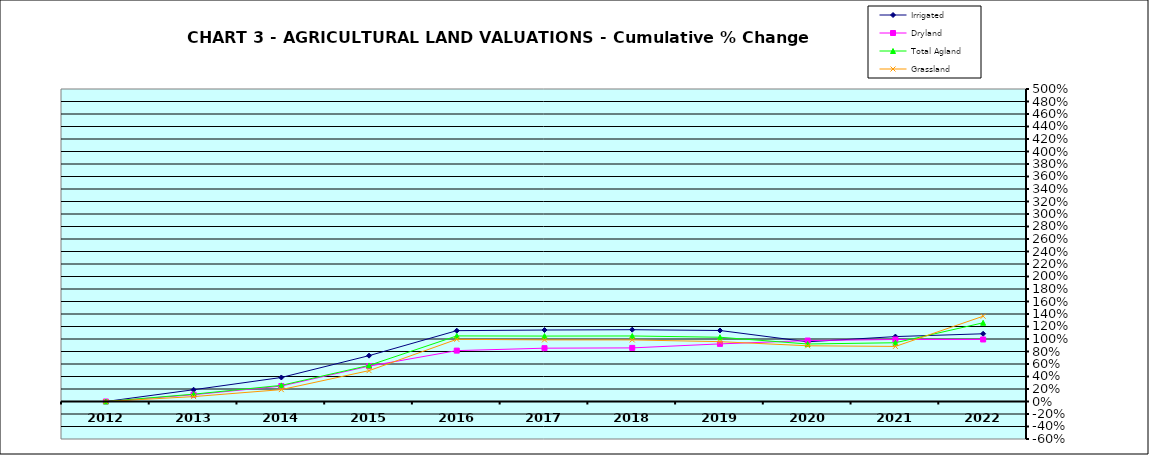
| Category | Irrigated | Dryland | Total Agland | Grassland |
|---|---|---|---|---|
| 2012.0 | 0 | 0 | 0 | 0 |
| 2013.0 | 0.188 | 0.109 | 0.117 | 0.078 |
| 2014.0 | 0.384 | 0.247 | 0.258 | 0.19 |
| 2015.0 | 0.734 | 0.566 | 0.578 | 0.494 |
| 2016.0 | 1.133 | 0.814 | 1.049 | 0.995 |
| 2017.0 | 1.144 | 0.853 | 1.047 | 0.986 |
| 2018.0 | 1.149 | 0.858 | 1.048 | 0.985 |
| 2019.0 | 1.136 | 0.922 | 1.028 | 0.957 |
| 2020.0 | 0.955 | 0.975 | 0.92 | 0.892 |
| 2021.0 | 1.039 | 0.992 | 0.94 | 0.881 |
| 2022.0 | 1.084 | 0.992 | 1.259 | 1.364 |